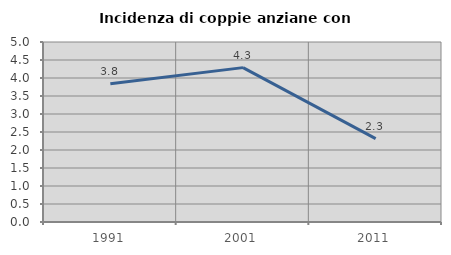
| Category | Incidenza di coppie anziane con figli |
|---|---|
| 1991.0 | 3.839 |
| 2001.0 | 4.288 |
| 2011.0 | 2.316 |